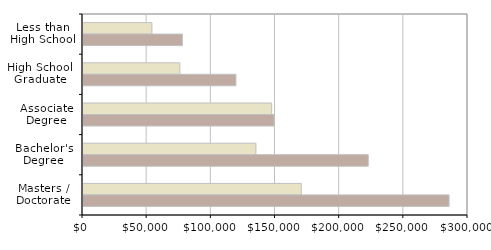
| Category | 2000 | 2010 |
|---|---|---|
| Less than
High School | 53696 | 77415 |
| High School
Graduate | 75478 | 119166 |
| Associate
Degree | 147004 | 148928 |
| Bachelor's
Degree | 134743 | 222282 |
| Masters / 
Doctorate  | 170103 | 285236 |